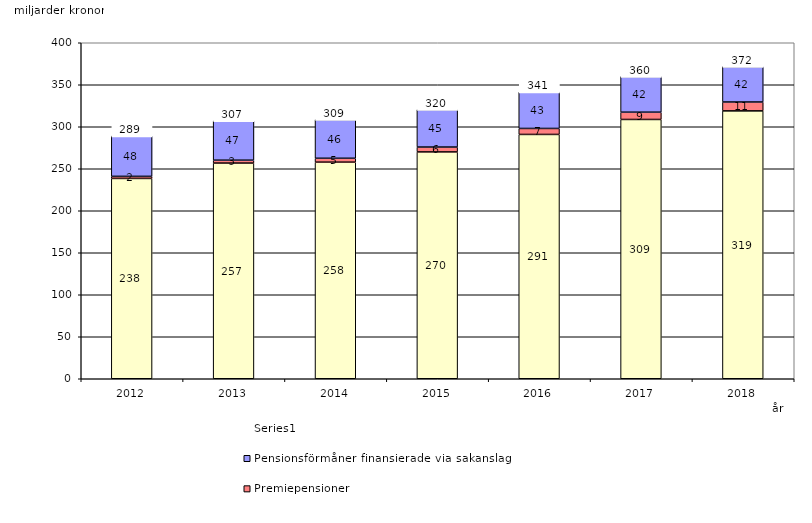
| Category | Inkomstpension och tilläggspension m.m. | Premiepensioner | Pensionsförmåner finansierade via sakanslag | Series 0 |
|---|---|---|---|---|
| 2012.0 | 238.478 | 2.465 | 48.024 | 20 |
| 2013.0 | 256.783 | 3.411 | 46.822 | 20 |
| 2014.0 | 257.85 | 4.65 | 46.023 | 20 |
| 2015.0 | 270.042 | 5.799 | 44.653 | 20 |
| 2016.0 | 290.856 | 7.12 | 43.337 | 20 |
| 2017.0 | 308.677 | 8.674 | 42.498 | 20 |
| 2018.0 | 318.903 | 10.563 | 42.139 | 20 |